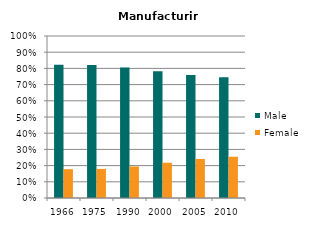
| Category | Male | Female |
|---|---|---|
| 1966.0 | 0.822 | 0.178 |
| 1975.0 | 0.82 | 0.18 |
| 1990.0 | 0.805 | 0.195 |
| 2000.0 | 0.782 | 0.218 |
| 2005.0 | 0.759 | 0.241 |
| 2010.0 | 0.745 | 0.255 |